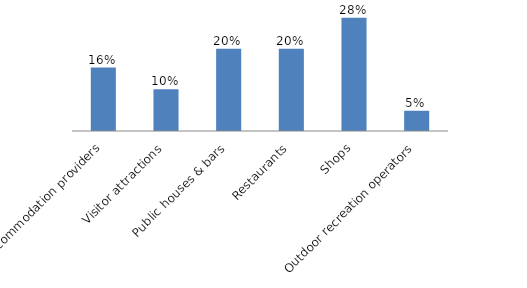
| Category | Series 0 |
|---|---|
| Accommodation providers | 0.157 |
| Visitor attractions | 0.104 |
| Public houses & bars | 0.204 |
| Restaurants | 0.204 |
| Shops | 0.281 |
| Outdoor recreation operators | 0.05 |